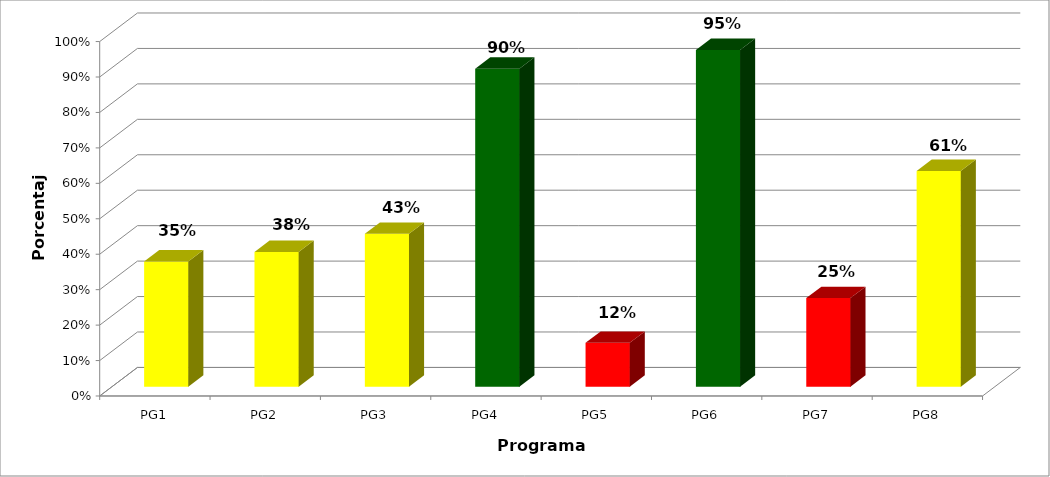
| Category | Series 0 |
|---|---|
| PG1 | 0.353 |
| PG2 | 0.38 |
| PG3 | 0.431 |
| PG4 | 0.897 |
| PG5 | 0.124 |
| PG6 | 0.95 |
| PG7 | 0.25 |
| PG8 | 0.609 |